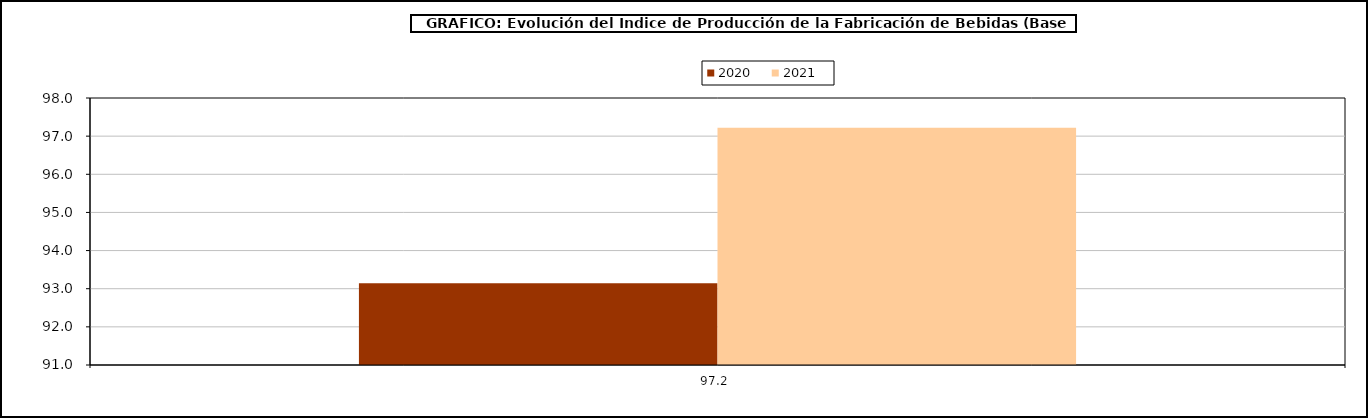
| Category | 2020 | 2021 |
|---|---|---|
| 97.21683333333334 | 93.144 | 97.217 |